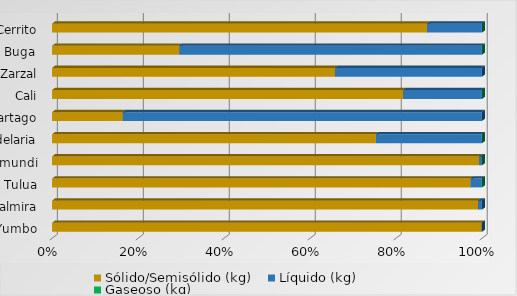
| Category | Sólido/Semisólido (kg) | Líquido (kg) | Gaseoso (kg) |
|---|---|---|---|
| Yumbo | 4618063.7 | 4217 | 0 |
| Palmira | 3530053.4 | 31964 | 0 |
| Tulua | 801178.28 | 21493.21 | 86 |
| Jamundi | 745183.61 | 4696.8 | 0 |
| Candelaria | 432518.42 | 141631 | 0 |
| Cartago | 85720.14 | 435374.52 | 0 |
| Cali | 414177.35 | 92609.16 | 0 |
| Zarzal | 313051.4 | 162526.2 | 0 |
| Guadalajara De Buga | 98406.72 | 233763.5 | 0 |
| El Cerrito | 274290 | 40022.15 | 0 |